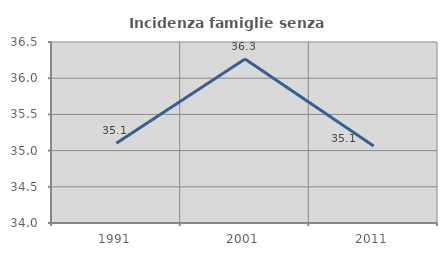
| Category | Incidenza famiglie senza nuclei |
|---|---|
| 1991.0 | 35.102 |
| 2001.0 | 36.264 |
| 2011.0 | 35.065 |